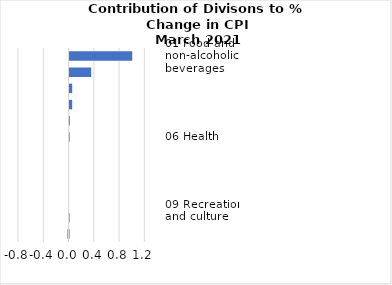
| Category |     Contributions |
|---|---|
| 01 Food and non-alcoholic beverages | 0.993 |
| 07 Transport | 0.343 |
| 04 Housing, water, electricity, gas and other fuels | 0.042 |
| 05 Furnishings, household equipment and routine household maintenance | 0.042 |
| 02 Alcoholic beverages, tobacco and narcotics | 0.004 |
| 06 Health | 0.001 |
| 08 Communication | 0 |
| 11 Restaurants and hotels | 0 |
| 03 Clothing and footwear | 0 |
| 10 Education | 0 |
| 09 Recreation and culture | -0.003 |
| 12 Miscellaneous goods and services | -0.017 |